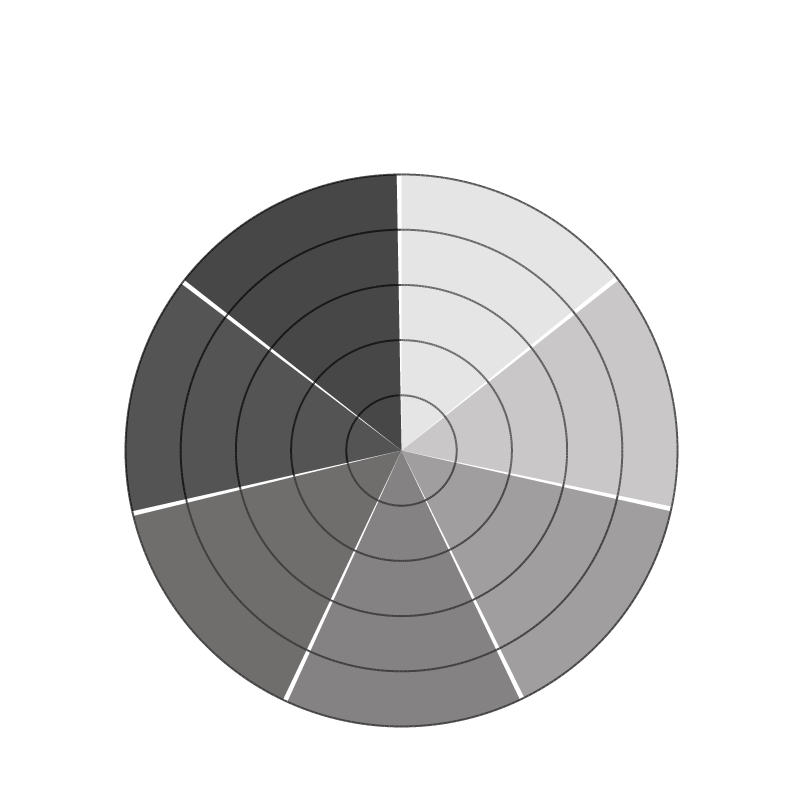
| Category | Verbruik | Productie | Fysieke ruimte voor zon-PV? | Terugleververmogen | Piekvebruik | Fysieke ruimte voor wind? | Blanco |
|---|---|---|---|---|---|---|---|
| 0 | 10 | 0 | 0 | 0 | 0 | 0 | 0 |
| 1 | 10 | 0 | 0 | 0 | 0 | 0 | 0 |
| 2 | 10 | 0 | 0 | 0 | 0 | 0 | 0 |
| 3 | 10 | 0 | 0 | 0 | 0 | 0 | 0 |
| 4 | 10 | 0 | 0 | 0 | 0 | 0 | 0 |
| 5 | 10 | 0 | 0 | 0 | 0 | 0 | 0 |
| 6 | 10 | 0 | 0 | 0 | 0 | 0 | 0 |
| 7 | 10 | 0 | 0 | 0 | 0 | 0 | 0 |
| 8 | 10 | 0 | 0 | 0 | 0 | 0 | 0 |
| 9 | 10 | 0 | 0 | 0 | 0 | 0 | 0 |
| 10 | 10 | 0 | 0 | 0 | 0 | 0 | 0 |
| 11 | 10 | 0 | 0 | 0 | 0 | 0 | 0 |
| 12 | 10 | 0 | 0 | 0 | 0 | 0 | 0 |
| 13 | 10 | 0 | 0 | 0 | 0 | 0 | 0 |
| 14 | 10 | 0 | 0 | 0 | 0 | 0 | 0 |
| 15 | 10 | 0 | 0 | 0 | 0 | 0 | 0 |
| 16 | 10 | 0 | 0 | 0 | 0 | 0 | 0 |
| 17 | 10 | 0 | 0 | 0 | 0 | 0 | 0 |
| 18 | 10 | 0 | 0 | 0 | 0 | 0 | 0 |
| 19 | 10 | 0 | 0 | 0 | 0 | 0 | 0 |
| 20 | 10 | 0 | 0 | 0 | 0 | 0 | 0 |
| 21 | 10 | 0 | 0 | 0 | 0 | 0 | 0 |
| 22 | 10 | 0 | 0 | 0 | 0 | 0 | 0 |
| 23 | 10 | 0 | 0 | 0 | 0 | 0 | 0 |
| 24 | 10 | 0 | 0 | 0 | 0 | 0 | 0 |
| 25 | 10 | 0 | 0 | 0 | 0 | 0 | 0 |
| 26 | 10 | 0 | 0 | 0 | 0 | 0 | 0 |
| 27 | 10 | 0 | 0 | 0 | 0 | 0 | 0 |
| 28 | 10 | 0 | 0 | 0 | 0 | 0 | 0 |
| 29 | 10 | 0 | 0 | 0 | 0 | 0 | 0 |
| 30 | 10 | 0 | 0 | 0 | 0 | 0 | 0 |
| 31 | 10 | 0 | 0 | 0 | 0 | 0 | 0 |
| 32 | 10 | 0 | 0 | 0 | 0 | 0 | 0 |
| 33 | 10 | 0 | 0 | 0 | 0 | 0 | 0 |
| 34 | 10 | 0 | 0 | 0 | 0 | 0 | 0 |
| 35 | 10 | 0 | 0 | 0 | 0 | 0 | 0 |
| 36 | 10 | 0 | 0 | 0 | 0 | 0 | 0 |
| 37 | 10 | 0 | 0 | 0 | 0 | 0 | 0 |
| 38 | 10 | 0 | 0 | 0 | 0 | 0 | 0 |
| 39 | 10 | 0 | 0 | 0 | 0 | 0 | 0 |
| 40 | 10 | 0 | 0 | 0 | 0 | 0 | 0 |
| 41 | 10 | 0 | 0 | 0 | 0 | 0 | 0 |
| 42 | 10 | 0 | 0 | 0 | 0 | 0 | 0 |
| 43 | 10 | 0 | 0 | 0 | 0 | 0 | 0 |
| 44 | 10 | 0 | 0 | 0 | 0 | 0 | 0 |
| 45 | 10 | 0 | 0 | 0 | 0 | 0 | 0 |
| 46 | 10 | 0 | 0 | 0 | 0 | 0 | 0 |
| 47 | 10 | 0 | 0 | 0 | 0 | 0 | 0 |
| 48 | 10 | 0 | 0 | 0 | 0 | 0 | 0 |
| 49 | 10 | 0 | 0 | 0 | 0 | 0 | 0 |
| 50 | 10 | 0 | 0 | 0 | 0 | 0 | 0 |
| 51 | 10 | 0 | 0 | 0 | 0 | 0 | 0 |
| 52 | 0 | 10 | 0 | 0 | 0 | 0 | 0 |
| 53 | 0 | 10 | 0 | 0 | 0 | 0 | 0 |
| 54 | 0 | 10 | 0 | 0 | 0 | 0 | 0 |
| 55 | 0 | 10 | 0 | 0 | 0 | 0 | 0 |
| 56 | 0 | 10 | 0 | 0 | 0 | 0 | 0 |
| 57 | 0 | 10 | 0 | 0 | 0 | 0 | 0 |
| 58 | 0 | 10 | 0 | 0 | 0 | 0 | 0 |
| 59 | 0 | 10 | 0 | 0 | 0 | 0 | 0 |
| 60 | 0 | 10 | 0 | 0 | 0 | 0 | 0 |
| 61 | 0 | 10 | 0 | 0 | 0 | 0 | 0 |
| 62 | 0 | 10 | 0 | 0 | 0 | 0 | 0 |
| 63 | 0 | 10 | 0 | 0 | 0 | 0 | 0 |
| 64 | 0 | 10 | 0 | 0 | 0 | 0 | 0 |
| 65 | 0 | 10 | 0 | 0 | 0 | 0 | 0 |
| 66 | 0 | 10 | 0 | 0 | 0 | 0 | 0 |
| 67 | 0 | 10 | 0 | 0 | 0 | 0 | 0 |
| 68 | 0 | 10 | 0 | 0 | 0 | 0 | 0 |
| 69 | 0 | 10 | 0 | 0 | 0 | 0 | 0 |
| 70 | 0 | 10 | 0 | 0 | 0 | 0 | 0 |
| 71 | 0 | 10 | 0 | 0 | 0 | 0 | 0 |
| 72 | 0 | 10 | 0 | 0 | 0 | 0 | 0 |
| 73 | 0 | 10 | 0 | 0 | 0 | 0 | 0 |
| 74 | 0 | 10 | 0 | 0 | 0 | 0 | 0 |
| 75 | 0 | 10 | 0 | 0 | 0 | 0 | 0 |
| 76 | 0 | 10 | 0 | 0 | 0 | 0 | 0 |
| 77 | 0 | 10 | 0 | 0 | 0 | 0 | 0 |
| 78 | 0 | 10 | 0 | 0 | 0 | 0 | 0 |
| 79 | 0 | 10 | 0 | 0 | 0 | 0 | 0 |
| 80 | 0 | 10 | 0 | 0 | 0 | 0 | 0 |
| 81 | 0 | 10 | 0 | 0 | 0 | 0 | 0 |
| 82 | 0 | 10 | 0 | 0 | 0 | 0 | 0 |
| 83 | 0 | 10 | 0 | 0 | 0 | 0 | 0 |
| 84 | 0 | 10 | 0 | 0 | 0 | 0 | 0 |
| 85 | 0 | 10 | 0 | 0 | 0 | 0 | 0 |
| 86 | 0 | 10 | 0 | 0 | 0 | 0 | 0 |
| 87 | 0 | 10 | 0 | 0 | 0 | 0 | 0 |
| 88 | 0 | 10 | 0 | 0 | 0 | 0 | 0 |
| 89 | 0 | 10 | 0 | 0 | 0 | 0 | 0 |
| 90 | 0 | 10 | 0 | 0 | 0 | 0 | 0 |
| 91 | 0 | 10 | 0 | 0 | 0 | 0 | 0 |
| 92 | 0 | 10 | 0 | 0 | 0 | 0 | 0 |
| 93 | 0 | 10 | 0 | 0 | 0 | 0 | 0 |
| 94 | 0 | 10 | 0 | 0 | 0 | 0 | 0 |
| 95 | 0 | 10 | 0 | 0 | 0 | 0 | 0 |
| 96 | 0 | 10 | 0 | 0 | 0 | 0 | 0 |
| 97 | 0 | 10 | 0 | 0 | 0 | 0 | 0 |
| 98 | 0 | 10 | 0 | 0 | 0 | 0 | 0 |
| 99 | 0 | 10 | 0 | 0 | 0 | 0 | 0 |
| 100 | 0 | 10 | 0 | 0 | 0 | 0 | 0 |
| 101 | 0 | 10 | 0 | 0 | 0 | 0 | 0 |
| 102 | 0 | 10 | 0 | 0 | 0 | 0 | 0 |
| 103 | 0 | 0 | 0 | 0 | 0 | 0 | 0 |
| 104 | 0 | 0 | 0 | 0 | 0 | 0 | 0 |
| 105 | 0 | 0 | 0 | 0 | 0 | 0 | 0 |
| 106 | 0 | 0 | 0 | 0 | 0 | 0 | 0 |
| 107 | 0 | 0 | 0 | 0 | 0 | 0 | 0 |
| 108 | 0 | 0 | 0 | 0 | 0 | 0 | 0 |
| 109 | 0 | 0 | 0 | 0 | 0 | 0 | 0 |
| 110 | 0 | 0 | 0 | 0 | 0 | 0 | 0 |
| 111 | 0 | 0 | 0 | 0 | 0 | 0 | 0 |
| 112 | 0 | 0 | 0 | 0 | 0 | 0 | 0 |
| 113 | 0 | 0 | 0 | 0 | 0 | 0 | 0 |
| 114 | 0 | 0 | 0 | 0 | 0 | 0 | 0 |
| 115 | 0 | 0 | 0 | 0 | 0 | 0 | 0 |
| 116 | 0 | 0 | 0 | 0 | 0 | 0 | 0 |
| 117 | 0 | 0 | 0 | 0 | 0 | 0 | 0 |
| 118 | 0 | 0 | 0 | 0 | 0 | 0 | 0 |
| 119 | 0 | 0 | 0 | 0 | 0 | 0 | 0 |
| 120 | 0 | 0 | 0 | 0 | 0 | 0 | 0 |
| 121 | 0 | 0 | 0 | 0 | 0 | 0 | 0 |
| 122 | 0 | 0 | 0 | 0 | 0 | 0 | 0 |
| 123 | 0 | 0 | 0 | 0 | 0 | 0 | 0 |
| 124 | 0 | 0 | 0 | 0 | 0 | 0 | 0 |
| 125 | 0 | 0 | 0 | 0 | 0 | 0 | 0 |
| 126 | 0 | 0 | 0 | 0 | 0 | 0 | 0 |
| 127 | 0 | 0 | 0 | 0 | 0 | 0 | 0 |
| 128 | 0 | 0 | 0 | 0 | 0 | 0 | 0 |
| 129 | 0 | 0 | 0 | 0 | 0 | 0 | 0 |
| 130 | 0 | 0 | 0 | 0 | 0 | 0 | 0 |
| 131 | 0 | 0 | 0 | 0 | 0 | 0 | 0 |
| 132 | 0 | 0 | 0 | 0 | 0 | 0 | 0 |
| 133 | 0 | 0 | 0 | 0 | 0 | 0 | 0 |
| 134 | 0 | 0 | 0 | 0 | 0 | 0 | 0 |
| 135 | 0 | 0 | 0 | 0 | 0 | 0 | 0 |
| 136 | 0 | 0 | 0 | 0 | 0 | 0 | 0 |
| 137 | 0 | 0 | 0 | 0 | 0 | 0 | 0 |
| 138 | 0 | 0 | 0 | 0 | 0 | 0 | 0 |
| 139 | 0 | 0 | 0 | 0 | 0 | 0 | 0 |
| 140 | 0 | 0 | 0 | 0 | 0 | 0 | 0 |
| 141 | 0 | 0 | 0 | 0 | 0 | 0 | 0 |
| 142 | 0 | 0 | 0 | 0 | 0 | 0 | 0 |
| 143 | 0 | 0 | 0 | 0 | 0 | 0 | 0 |
| 144 | 0 | 0 | 0 | 0 | 0 | 0 | 0 |
| 145 | 0 | 0 | 0 | 0 | 0 | 0 | 0 |
| 146 | 0 | 0 | 0 | 0 | 0 | 0 | 0 |
| 147 | 0 | 0 | 0 | 0 | 0 | 0 | 0 |
| 148 | 0 | 0 | 0 | 0 | 0 | 0 | 0 |
| 149 | 0 | 0 | 0 | 0 | 0 | 0 | 0 |
| 150 | 0 | 0 | 0 | 0 | 0 | 0 | 0 |
| 151 | 0 | 0 | 0 | 0 | 0 | 0 | 0 |
| 152 | 0 | 0 | 0 | 0 | 0 | 0 | 0 |
| 153 | 0 | 0 | 0 | 0 | 0 | 0 | 0 |
| 154 | 0 | 0 | 0 | 0 | 0 | 0 | 0 |
| 155 | 0 | 0 | 0 | 10 | 0 | 0 | 0 |
| 156 | 0 | 0 | 0 | 10 | 0 | 0 | 0 |
| 157 | 0 | 0 | 0 | 10 | 0 | 0 | 0 |
| 158 | 0 | 0 | 0 | 10 | 0 | 0 | 0 |
| 159 | 0 | 0 | 0 | 10 | 0 | 0 | 0 |
| 160 | 0 | 0 | 0 | 10 | 0 | 0 | 0 |
| 161 | 0 | 0 | 0 | 10 | 0 | 0 | 0 |
| 162 | 0 | 0 | 0 | 10 | 0 | 0 | 0 |
| 163 | 0 | 0 | 0 | 10 | 0 | 0 | 0 |
| 164 | 0 | 0 | 0 | 10 | 0 | 0 | 0 |
| 165 | 0 | 0 | 0 | 10 | 0 | 0 | 0 |
| 166 | 0 | 0 | 0 | 10 | 0 | 0 | 0 |
| 167 | 0 | 0 | 0 | 10 | 0 | 0 | 0 |
| 168 | 0 | 0 | 0 | 10 | 0 | 0 | 0 |
| 169 | 0 | 0 | 0 | 10 | 0 | 0 | 0 |
| 170 | 0 | 0 | 0 | 10 | 0 | 0 | 0 |
| 171 | 0 | 0 | 0 | 10 | 0 | 0 | 0 |
| 172 | 0 | 0 | 0 | 10 | 0 | 0 | 0 |
| 173 | 0 | 0 | 0 | 10 | 0 | 0 | 0 |
| 174 | 0 | 0 | 0 | 10 | 0 | 0 | 0 |
| 175 | 0 | 0 | 0 | 10 | 0 | 0 | 0 |
| 176 | 0 | 0 | 0 | 10 | 0 | 0 | 0 |
| 177 | 0 | 0 | 0 | 10 | 0 | 0 | 0 |
| 178 | 0 | 0 | 0 | 10 | 0 | 0 | 0 |
| 179 | 0 | 0 | 0 | 10 | 0 | 0 | 0 |
| 180 | 0 | 0 | 0 | 10 | 0 | 0 | 0 |
| 181 | 0 | 0 | 0 | 10 | 0 | 0 | 0 |
| 182 | 0 | 0 | 0 | 10 | 0 | 0 | 0 |
| 183 | 0 | 0 | 0 | 10 | 0 | 0 | 0 |
| 184 | 0 | 0 | 0 | 10 | 0 | 0 | 0 |
| 185 | 0 | 0 | 0 | 10 | 0 | 0 | 0 |
| 186 | 0 | 0 | 0 | 10 | 0 | 0 | 0 |
| 187 | 0 | 0 | 0 | 10 | 0 | 0 | 0 |
| 188 | 0 | 0 | 0 | 10 | 0 | 0 | 0 |
| 189 | 0 | 0 | 0 | 10 | 0 | 0 | 0 |
| 190 | 0 | 0 | 0 | 10 | 0 | 0 | 0 |
| 191 | 0 | 0 | 0 | 10 | 0 | 0 | 0 |
| 192 | 0 | 0 | 0 | 10 | 0 | 0 | 0 |
| 193 | 0 | 0 | 0 | 10 | 0 | 0 | 0 |
| 194 | 0 | 0 | 0 | 10 | 0 | 0 | 0 |
| 195 | 0 | 0 | 0 | 10 | 0 | 0 | 0 |
| 196 | 0 | 0 | 0 | 10 | 0 | 0 | 0 |
| 197 | 0 | 0 | 0 | 10 | 0 | 0 | 0 |
| 198 | 0 | 0 | 0 | 10 | 0 | 0 | 0 |
| 199 | 0 | 0 | 0 | 10 | 0 | 0 | 0 |
| 200 | 0 | 0 | 0 | 10 | 0 | 0 | 0 |
| 201 | 0 | 0 | 0 | 10 | 0 | 0 | 0 |
| 202 | 0 | 0 | 0 | 10 | 0 | 0 | 0 |
| 203 | 0 | 0 | 0 | 10 | 0 | 0 | 0 |
| 204 | 0 | 0 | 0 | 10 | 0 | 0 | 0 |
| 205 | 0 | 0 | 0 | 10 | 0 | 0 | 0 |
| 206 | 0 | 0 | 0 | 0 | 10 | 0 | 0 |
| 207 | 0 | 0 | 0 | 0 | 10 | 0 | 0 |
| 208 | 0 | 0 | 0 | 0 | 10 | 0 | 0 |
| 209 | 0 | 0 | 0 | 0 | 10 | 0 | 0 |
| 210 | 0 | 0 | 0 | 0 | 10 | 0 | 0 |
| 211 | 0 | 0 | 0 | 0 | 10 | 0 | 0 |
| 212 | 0 | 0 | 0 | 0 | 10 | 0 | 0 |
| 213 | 0 | 0 | 0 | 0 | 10 | 0 | 0 |
| 214 | 0 | 0 | 0 | 0 | 10 | 0 | 0 |
| 215 | 0 | 0 | 0 | 0 | 10 | 0 | 0 |
| 216 | 0 | 0 | 0 | 0 | 10 | 0 | 0 |
| 217 | 0 | 0 | 0 | 0 | 10 | 0 | 0 |
| 218 | 0 | 0 | 0 | 0 | 10 | 0 | 0 |
| 219 | 0 | 0 | 0 | 0 | 10 | 0 | 0 |
| 220 | 0 | 0 | 0 | 0 | 10 | 0 | 0 |
| 221 | 0 | 0 | 0 | 0 | 10 | 0 | 0 |
| 222 | 0 | 0 | 0 | 0 | 10 | 0 | 0 |
| 223 | 0 | 0 | 0 | 0 | 10 | 0 | 0 |
| 224 | 0 | 0 | 0 | 0 | 10 | 0 | 0 |
| 225 | 0 | 0 | 0 | 0 | 10 | 0 | 0 |
| 226 | 0 | 0 | 0 | 0 | 10 | 0 | 0 |
| 227 | 0 | 0 | 0 | 0 | 10 | 0 | 0 |
| 228 | 0 | 0 | 0 | 0 | 10 | 0 | 0 |
| 229 | 0 | 0 | 0 | 0 | 10 | 0 | 0 |
| 230 | 0 | 0 | 0 | 0 | 10 | 0 | 0 |
| 231 | 0 | 0 | 0 | 0 | 10 | 0 | 0 |
| 232 | 0 | 0 | 0 | 0 | 10 | 0 | 0 |
| 233 | 0 | 0 | 0 | 0 | 10 | 0 | 0 |
| 234 | 0 | 0 | 0 | 0 | 10 | 0 | 0 |
| 235 | 0 | 0 | 0 | 0 | 10 | 0 | 0 |
| 236 | 0 | 0 | 0 | 0 | 10 | 0 | 0 |
| 237 | 0 | 0 | 0 | 0 | 10 | 0 | 0 |
| 238 | 0 | 0 | 0 | 0 | 10 | 0 | 0 |
| 239 | 0 | 0 | 0 | 0 | 10 | 0 | 0 |
| 240 | 0 | 0 | 0 | 0 | 10 | 0 | 0 |
| 241 | 0 | 0 | 0 | 0 | 10 | 0 | 0 |
| 242 | 0 | 0 | 0 | 0 | 10 | 0 | 0 |
| 243 | 0 | 0 | 0 | 0 | 10 | 0 | 0 |
| 244 | 0 | 0 | 0 | 0 | 10 | 0 | 0 |
| 245 | 0 | 0 | 0 | 0 | 10 | 0 | 0 |
| 246 | 0 | 0 | 0 | 0 | 10 | 0 | 0 |
| 247 | 0 | 0 | 0 | 0 | 10 | 0 | 0 |
| 248 | 0 | 0 | 0 | 0 | 10 | 0 | 0 |
| 249 | 0 | 0 | 0 | 0 | 10 | 0 | 0 |
| 250 | 0 | 0 | 0 | 0 | 10 | 0 | 0 |
| 251 | 0 | 0 | 0 | 0 | 10 | 0 | 0 |
| 252 | 0 | 0 | 0 | 0 | 10 | 0 | 0 |
| 253 | 0 | 0 | 0 | 0 | 10 | 0 | 0 |
| 254 | 0 | 0 | 0 | 0 | 10 | 0 | 0 |
| 255 | 0 | 0 | 0 | 0 | 10 | 0 | 0 |
| 256 | 0 | 0 | 0 | 0 | 10 | 0 | 0 |
| 257 | 0 | 0 | 0 | 0 | 10 | 0 | 0 |
| 258 | 0 | 0 | 10 | 0 | 0 | 0 | 0 |
| 259 | 0 | 0 | 10 | 0 | 0 | 0 | 0 |
| 260 | 0 | 0 | 10 | 0 | 0 | 0 | 0 |
| 261 | 0 | 0 | 10 | 0 | 0 | 0 | 0 |
| 262 | 0 | 0 | 10 | 0 | 0 | 0 | 0 |
| 263 | 0 | 0 | 10 | 0 | 0 | 0 | 0 |
| 264 | 0 | 0 | 10 | 0 | 0 | 0 | 0 |
| 265 | 0 | 0 | 10 | 0 | 0 | 0 | 0 |
| 266 | 0 | 0 | 10 | 0 | 0 | 0 | 0 |
| 267 | 0 | 0 | 10 | 0 | 0 | 0 | 0 |
| 268 | 0 | 0 | 10 | 0 | 0 | 0 | 0 |
| 269 | 0 | 0 | 10 | 0 | 0 | 0 | 0 |
| 270 | 0 | 0 | 10 | 0 | 0 | 0 | 0 |
| 271 | 0 | 0 | 10 | 0 | 0 | 0 | 0 |
| 272 | 0 | 0 | 10 | 0 | 0 | 0 | 0 |
| 273 | 0 | 0 | 10 | 0 | 0 | 0 | 0 |
| 274 | 0 | 0 | 10 | 0 | 0 | 0 | 0 |
| 275 | 0 | 0 | 10 | 0 | 0 | 0 | 0 |
| 276 | 0 | 0 | 10 | 0 | 0 | 0 | 0 |
| 277 | 0 | 0 | 10 | 0 | 0 | 0 | 0 |
| 278 | 0 | 0 | 10 | 0 | 0 | 0 | 0 |
| 279 | 0 | 0 | 10 | 0 | 0 | 0 | 0 |
| 280 | 0 | 0 | 10 | 0 | 0 | 0 | 0 |
| 281 | 0 | 0 | 10 | 0 | 0 | 0 | 0 |
| 282 | 0 | 0 | 10 | 0 | 0 | 0 | 0 |
| 283 | 0 | 0 | 10 | 0 | 0 | 0 | 0 |
| 284 | 0 | 0 | 10 | 0 | 0 | 0 | 0 |
| 285 | 0 | 0 | 10 | 0 | 0 | 0 | 0 |
| 286 | 0 | 0 | 10 | 0 | 0 | 0 | 0 |
| 287 | 0 | 0 | 10 | 0 | 0 | 0 | 0 |
| 288 | 0 | 0 | 10 | 0 | 0 | 0 | 0 |
| 289 | 0 | 0 | 10 | 0 | 0 | 0 | 0 |
| 290 | 0 | 0 | 10 | 0 | 0 | 0 | 0 |
| 291 | 0 | 0 | 10 | 0 | 0 | 0 | 0 |
| 292 | 0 | 0 | 10 | 0 | 0 | 0 | 0 |
| 293 | 0 | 0 | 10 | 0 | 0 | 0 | 0 |
| 294 | 0 | 0 | 10 | 0 | 0 | 0 | 0 |
| 295 | 0 | 0 | 10 | 0 | 0 | 0 | 0 |
| 296 | 0 | 0 | 10 | 0 | 0 | 0 | 0 |
| 297 | 0 | 0 | 10 | 0 | 0 | 0 | 0 |
| 298 | 0 | 0 | 10 | 0 | 0 | 0 | 0 |
| 299 | 0 | 0 | 10 | 0 | 0 | 0 | 0 |
| 300 | 0 | 0 | 10 | 0 | 0 | 0 | 0 |
| 301 | 0 | 0 | 10 | 0 | 0 | 0 | 0 |
| 302 | 0 | 0 | 10 | 0 | 0 | 0 | 0 |
| 303 | 0 | 0 | 10 | 0 | 0 | 0 | 0 |
| 304 | 0 | 0 | 10 | 0 | 0 | 0 | 0 |
| 305 | 0 | 0 | 10 | 0 | 0 | 0 | 0 |
| 306 | 0 | 0 | 10 | 0 | 0 | 0 | 0 |
| 307 | 0 | 0 | 10 | 0 | 0 | 0 | 0 |
| 308 | 0 | 0 | 10 | 0 | 0 | 0 | 0 |
| 309 | 0 | 0 | 0 | 0 | 0 | 10 | 0 |
| 310 | 0 | 0 | 0 | 0 | 0 | 10 | 0 |
| 311 | 0 | 0 | 0 | 0 | 0 | 10 | 0 |
| 312 | 0 | 0 | 0 | 0 | 0 | 10 | 0 |
| 313 | 0 | 0 | 0 | 0 | 0 | 10 | 0 |
| 314 | 0 | 0 | 0 | 0 | 0 | 10 | 0 |
| 315 | 0 | 0 | 0 | 0 | 0 | 10 | 0 |
| 316 | 0 | 0 | 0 | 0 | 0 | 10 | 0 |
| 317 | 0 | 0 | 0 | 0 | 0 | 10 | 0 |
| 318 | 0 | 0 | 0 | 0 | 0 | 10 | 0 |
| 319 | 0 | 0 | 0 | 0 | 0 | 10 | 0 |
| 320 | 0 | 0 | 0 | 0 | 0 | 10 | 0 |
| 321 | 0 | 0 | 0 | 0 | 0 | 10 | 0 |
| 322 | 0 | 0 | 0 | 0 | 0 | 10 | 0 |
| 323 | 0 | 0 | 0 | 0 | 0 | 10 | 0 |
| 324 | 0 | 0 | 0 | 0 | 0 | 10 | 0 |
| 325 | 0 | 0 | 0 | 0 | 0 | 10 | 0 |
| 326 | 0 | 0 | 0 | 0 | 0 | 10 | 0 |
| 327 | 0 | 0 | 0 | 0 | 0 | 10 | 0 |
| 328 | 0 | 0 | 0 | 0 | 0 | 10 | 0 |
| 329 | 0 | 0 | 0 | 0 | 0 | 10 | 0 |
| 330 | 0 | 0 | 0 | 0 | 0 | 10 | 0 |
| 331 | 0 | 0 | 0 | 0 | 0 | 10 | 0 |
| 332 | 0 | 0 | 0 | 0 | 0 | 10 | 0 |
| 333 | 0 | 0 | 0 | 0 | 0 | 10 | 0 |
| 334 | 0 | 0 | 0 | 0 | 0 | 10 | 0 |
| 335 | 0 | 0 | 0 | 0 | 0 | 10 | 0 |
| 336 | 0 | 0 | 0 | 0 | 0 | 10 | 0 |
| 337 | 0 | 0 | 0 | 0 | 0 | 10 | 0 |
| 338 | 0 | 0 | 0 | 0 | 0 | 10 | 0 |
| 339 | 0 | 0 | 0 | 0 | 0 | 10 | 0 |
| 340 | 0 | 0 | 0 | 0 | 0 | 10 | 0 |
| 341 | 0 | 0 | 0 | 0 | 0 | 10 | 0 |
| 342 | 0 | 0 | 0 | 0 | 0 | 10 | 0 |
| 343 | 0 | 0 | 0 | 0 | 0 | 10 | 0 |
| 344 | 0 | 0 | 0 | 0 | 0 | 10 | 0 |
| 345 | 0 | 0 | 0 | 0 | 0 | 10 | 0 |
| 346 | 0 | 0 | 0 | 0 | 0 | 10 | 0 |
| 347 | 0 | 0 | 0 | 0 | 0 | 10 | 0 |
| 348 | 0 | 0 | 0 | 0 | 0 | 10 | 0 |
| 349 | 0 | 0 | 0 | 0 | 0 | 10 | 0 |
| 350 | 0 | 0 | 0 | 0 | 0 | 10 | 0 |
| 351 | 0 | 0 | 0 | 0 | 0 | 10 | 0 |
| 352 | 0 | 0 | 0 | 0 | 0 | 10 | 0 |
| 353 | 0 | 0 | 0 | 0 | 0 | 10 | 0 |
| 354 | 0 | 0 | 0 | 0 | 0 | 10 | 0 |
| 355 | 0 | 0 | 0 | 0 | 0 | 10 | 0 |
| 356 | 0 | 0 | 0 | 0 | 0 | 10 | 0 |
| 357 | 0 | 0 | 0 | 0 | 0 | 10 | 0 |
| 358 | 0 | 0 | 0 | 0 | 0 | 10 | 0 |
| 359 | 0 | 0 | 0 | 0 | 0 | 10 | 0 |
| 360 | 0 | 0 | 0 | 0 | 0 | 10 | 10 |